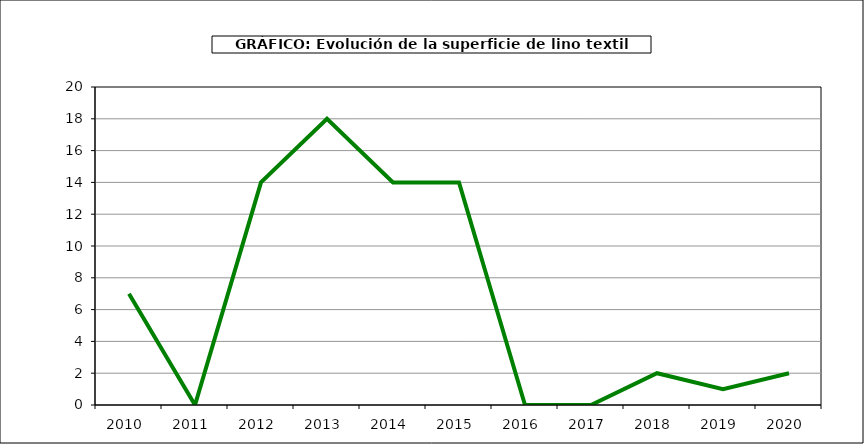
| Category | Superficie |
|---|---|
| 2010.0 | 7 |
| 2011.0 | 0 |
| 2012.0 | 14 |
| 2013.0 | 18 |
| 2014.0 | 14 |
| 2015.0 | 14 |
| 2016.0 | 0 |
| 2017.0 | 0 |
| 2018.0 | 2 |
| 2019.0 | 1 |
| 2020.0 | 2 |